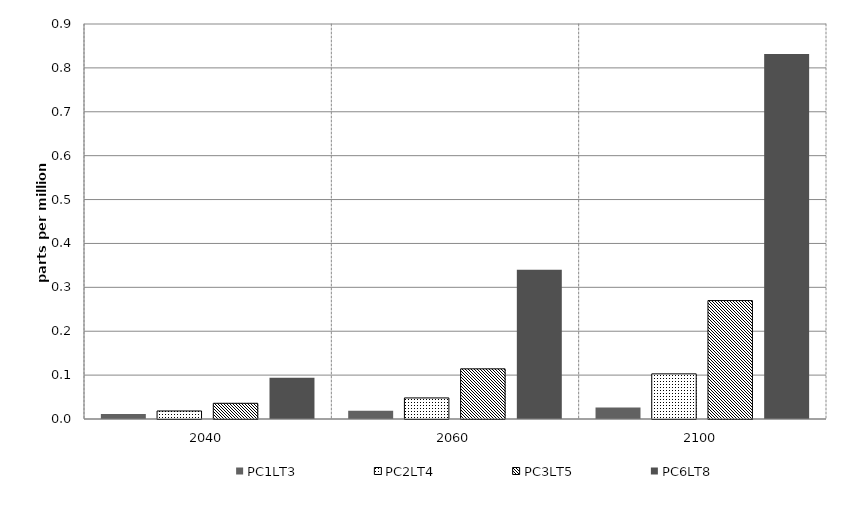
| Category | PC1LT3 | PC2LT4 | PC3LT5 | PC6LT8 | Alt 5 | Alt 6 | Alt 7 | Alt 8 | Alt 10 |
|---|---|---|---|---|---|---|---|---|---|
| 2040.0 | 0.012 | 0.018 | 0.036 | 0.094 |  |  |  |  |  |
| 2060.0 | 0.019 | 0.048 | 0.114 | 0.34 |  |  |  |  |  |
| 2100.0 | 0.026 | 0.103 | 0.27 | 0.832 |  |  |  |  |  |